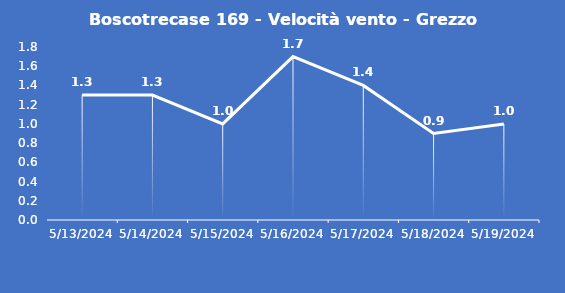
| Category | Boscotrecase 169 - Velocità vento - Grezzo (m/s) |
|---|---|
| 5/13/24 | 1.3 |
| 5/14/24 | 1.3 |
| 5/15/24 | 1 |
| 5/16/24 | 1.7 |
| 5/17/24 | 1.4 |
| 5/18/24 | 0.9 |
| 5/19/24 | 1 |